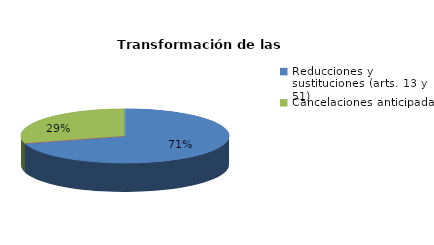
| Category | Series 0 |
|---|---|
| Reducciones y sustituciones (arts. 13 y 51) | 12 |
| Por quebrantamiento (art. 50.2) | 0 |
| Cancelaciones anticipadas | 5 |
| Traslado a Centros Penitenciarios | 0 |
| Conversión internamientos en cerrados (art. 51.2) | 0 |